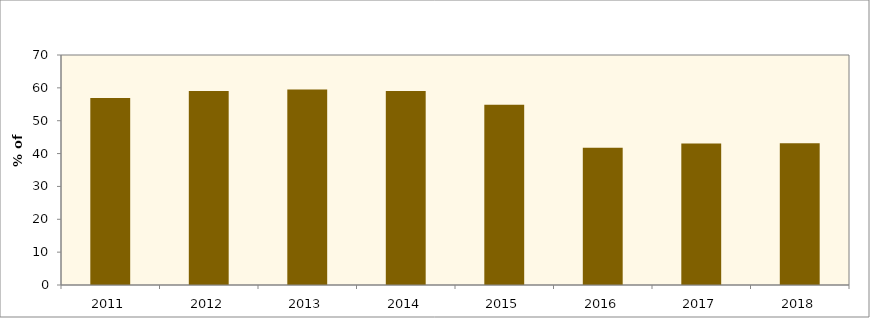
| Category | Series 1 |
|---|---|
| 2011.0 | 56.91 |
| 2012.0 | 59.042 |
| 2013.0 | 59.534 |
| 2014.0 | 59.017 |
| 2015.0 | 54.89 |
| 2016.0 | 41.74 |
| 2017.0 | 43.096 |
| 2018.0 | 43.123 |